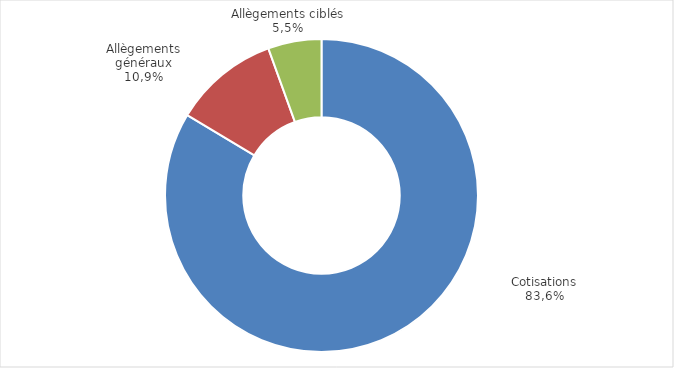
| Category | Series 0 |
|---|---|
| Cotisations employeurs | 8491.723 |
| Allègements généraux | 1106.3 |
| Allègements ciblés | 560.248 |